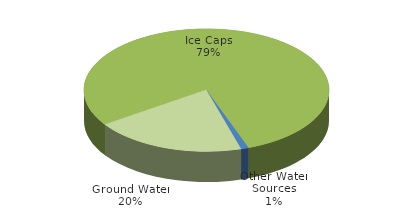
| Category | Series 0 |
|---|---|
| Other Water Sources | 100 |
| Ground Water | 2000 |
| Ice Caps | 7900 |